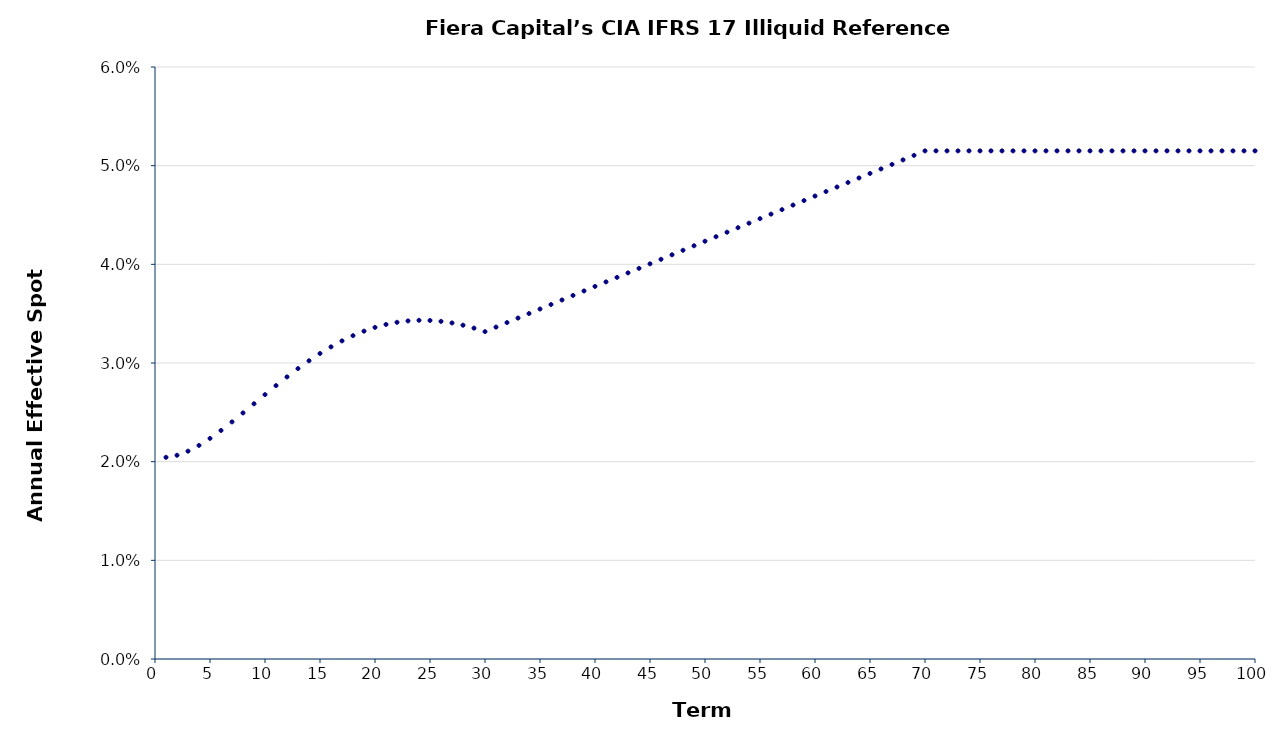
| Category | Annual Effective Spot Rate |
|---|---|
| 1.0 | 0.02 |
| 2.0 | 0.021 |
| 3.0 | 0.021 |
| 4.0 | 0.022 |
| 5.0 | 0.022 |
| 6.0 | 0.023 |
| 7.0 | 0.024 |
| 8.0 | 0.025 |
| 9.0 | 0.026 |
| 10.0 | 0.027 |
| 11.0 | 0.028 |
| 12.0 | 0.029 |
| 13.0 | 0.029 |
| 14.0 | 0.03 |
| 15.0 | 0.031 |
| 16.0 | 0.032 |
| 17.0 | 0.032 |
| 18.0 | 0.033 |
| 19.0 | 0.033 |
| 20.0 | 0.034 |
| 21.0 | 0.034 |
| 22.0 | 0.034 |
| 23.0 | 0.034 |
| 24.0 | 0.034 |
| 25.0 | 0.034 |
| 26.0 | 0.034 |
| 27.0 | 0.034 |
| 28.0 | 0.034 |
| 29.0 | 0.034 |
| 30.0 | 0.033 |
| 31.0 | 0.034 |
| 32.0 | 0.034 |
| 33.0 | 0.035 |
| 34.0 | 0.035 |
| 35.0 | 0.035 |
| 36.0 | 0.036 |
| 37.0 | 0.036 |
| 38.0 | 0.037 |
| 39.0 | 0.037 |
| 40.0 | 0.038 |
| 41.0 | 0.038 |
| 42.0 | 0.039 |
| 43.0 | 0.039 |
| 44.0 | 0.04 |
| 45.0 | 0.04 |
| 46.0 | 0.041 |
| 47.0 | 0.041 |
| 48.0 | 0.041 |
| 49.0 | 0.042 |
| 50.0 | 0.042 |
| 51.0 | 0.043 |
| 52.0 | 0.043 |
| 53.0 | 0.044 |
| 54.0 | 0.044 |
| 55.0 | 0.045 |
| 56.0 | 0.045 |
| 57.0 | 0.046 |
| 58.0 | 0.046 |
| 59.0 | 0.046 |
| 60.0 | 0.047 |
| 61.0 | 0.047 |
| 62.0 | 0.048 |
| 63.0 | 0.048 |
| 64.0 | 0.049 |
| 65.0 | 0.049 |
| 66.0 | 0.05 |
| 67.0 | 0.05 |
| 68.0 | 0.051 |
| 69.0 | 0.051 |
| 70.0 | 0.052 |
| 71.0 | 0.052 |
| 72.0 | 0.052 |
| 73.0 | 0.052 |
| 74.0 | 0.052 |
| 75.0 | 0.052 |
| 76.0 | 0.052 |
| 77.0 | 0.052 |
| 78.0 | 0.052 |
| 79.0 | 0.052 |
| 80.0 | 0.052 |
| 81.0 | 0.052 |
| 82.0 | 0.052 |
| 83.0 | 0.052 |
| 84.0 | 0.052 |
| 85.0 | 0.052 |
| 86.0 | 0.052 |
| 87.0 | 0.052 |
| 88.0 | 0.052 |
| 89.0 | 0.052 |
| 90.0 | 0.052 |
| 91.0 | 0.052 |
| 92.0 | 0.052 |
| 93.0 | 0.052 |
| 94.0 | 0.052 |
| 95.0 | 0.052 |
| 96.0 | 0.052 |
| 97.0 | 0.052 |
| 98.0 | 0.052 |
| 99.0 | 0.052 |
| 100.0 | 0.052 |